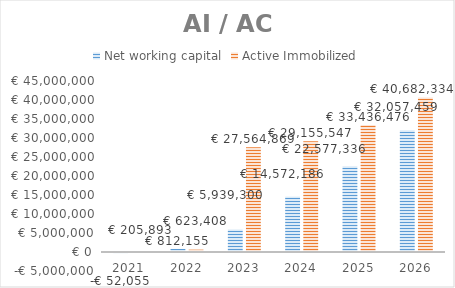
| Category | Net working capital | Active Immobilized |
|---|---|---|
| 2021.0 | -52055.032 | 205893.333 |
| 2022.0 | 812154.855 | 623407.841 |
| 2023.0 | 5939300.46 | 27564868.912 |
| 2024.0 | 14572186.071 | 29155546.709 |
| 2025.0 | 22577336.137 | 33436475.517 |
| 2026.0 | 32057459.482 | 40682333.56 |